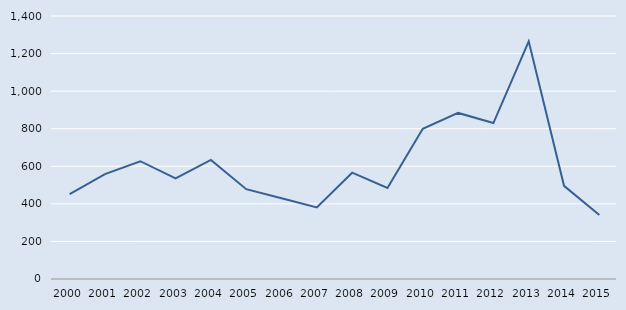
| Category | Series 0 |
|---|---|
| 2000.0 | 452 |
| 2001.0 | 558 |
| 2002.0 | 627 |
| 2003.0 | 536 |
| 2004.0 | 634 |
| 2005.0 | 478 |
| 2006.0 | 430 |
| 2007.0 | 381 |
| 2008.0 | 566 |
| 2009.0 | 485 |
| 2010.0 | 800 |
| 2011.0 | 884 |
| 2012.0 | 830 |
| 2013.0 | 1265 |
| 2014.0 | 496 |
| 2015.0 | 341 |